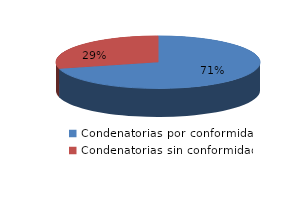
| Category | Series 0 |
|---|---|
| 0 | 39 |
| 1 | 16 |